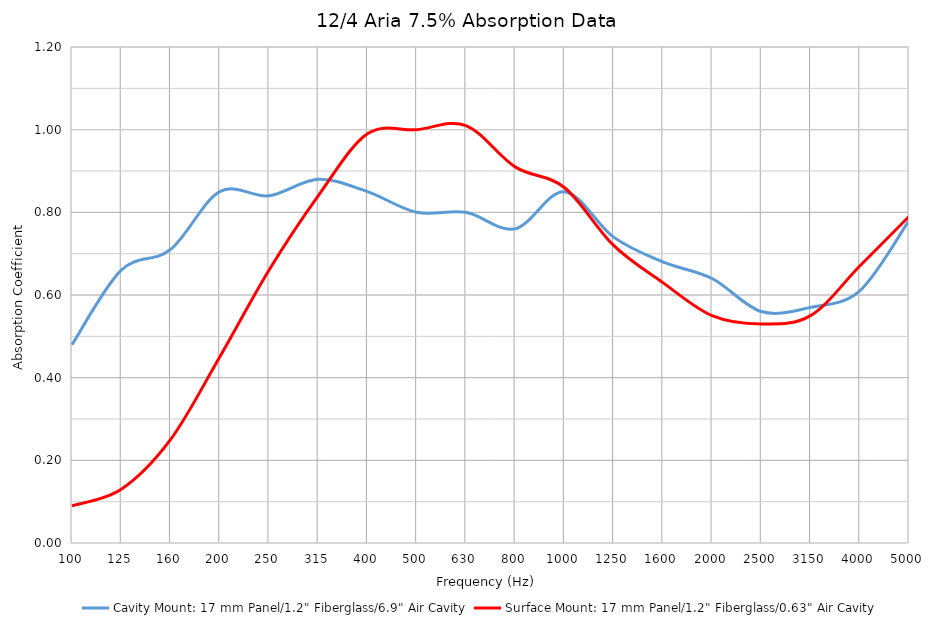
| Category | Cavity Mount: 17 mm Panel/1.2" Fiberglass/6.9" Air Cavity | Surface Mount: 17 mm Panel/1.2" Fiberglass/0.63" Air Cavity |
|---|---|---|
| 100.0 | 0.48 | 0.09 |
| 125.0 | 0.66 | 0.13 |
| 160.0 | 0.71 | 0.25 |
| 200.0 | 0.85 | 0.45 |
| 250.0 | 0.84 | 0.66 |
| 315.0 | 0.88 | 0.84 |
| 400.0 | 0.85 | 0.99 |
| 500.0 | 0.8 | 1 |
| 630.0 | 0.8 | 1.01 |
| 800.0 | 0.76 | 0.91 |
| 1000.0 | 0.85 | 0.86 |
| 1250.0 | 0.74 | 0.72 |
| 1600.0 | 0.68 | 0.63 |
| 2000.0 | 0.64 | 0.55 |
| 2500.0 | 0.56 | 0.53 |
| 3150.0 | 0.57 | 0.55 |
| 4000.0 | 0.61 | 0.67 |
| 5000.0 | 0.78 | 0.79 |